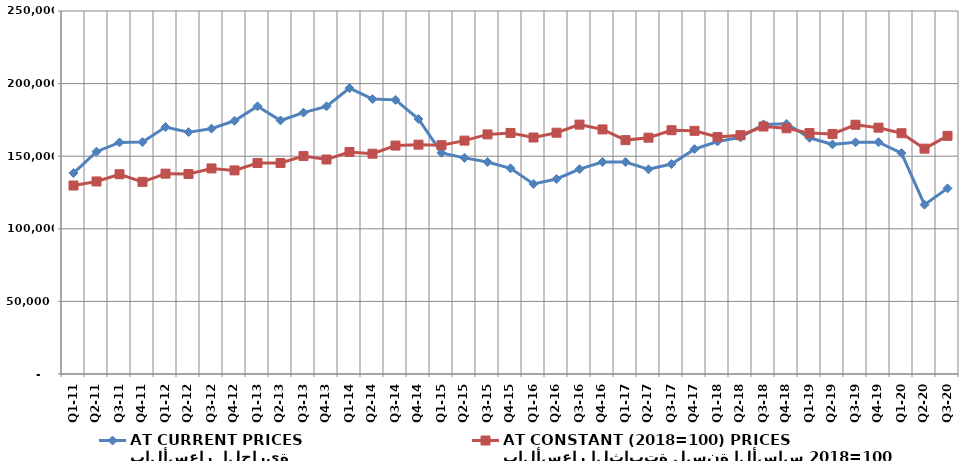
| Category | بالأسعار  الجارية 
AT CURRENT PRICES | بالأسعار الثابتة لسنة الأساس 2018=100
AT CONSTANT (2018=100) PRICES |
|---|---|---|
| Q1-11 | 138401.271 | 129804.239 |
| Q2-11 | 153089.762 | 132598.031 |
| Q3-11 | 159487.561 | 137565.295 |
| Q4-11 | 159723.384 | 132348.861 |
| Q1-12 | 170083.093 | 137982.104 |
| Q2-12 | 166591.685 | 137726.476 |
| Q3-12 | 168996.873 | 141580.056 |
| Q4-12 | 174402.297 | 140206.421 |
| Q1-13 | 184386.906 | 145295.802 |
| Q2-13 | 174597.258 | 145323.774 |
| Q3-13 | 180040.866 | 150108.501 |
| Q4-13 | 184343.591 | 147741.63 |
| Q1-14 | 196893.097 | 152884.316 |
| Q2-14 | 189356.652 | 151722.456 |
| Q3-14 | 188804.036 | 157306.957 |
| Q4-14 | 175603.753 | 157946.856 |
| Q1-15 | 152296.294 | 157548.933 |
| Q2-15 | 148854.913 | 160746.996 |
| Q3-15 | 145953.812 | 165017.31 |
| Q4-15 | 141628.419 | 166011.462 |
| Q1-16 | 130891.648 | 162867.899 |
| Q2-16 | 134312.351 | 166165.592 |
| Q3-16 | 141077.114 | 171750.759 |
| Q4-16 | 146024.029 | 168437.006 |
| Q1-17 | 145986.575 | 161083.599 |
| Q2-17 | 140973.578 | 162753.554 |
| Q3-17 | 144588.415 | 167889.538 |
| Q4-17 | 154852.238 | 167472.277 |
| Q1-18 | 160151.745 | 163190.321 |
| Q2-18 | 162958.727 | 164459.507 |
| Q3-18 | 171916.892 | 170445.991 |
| Q4-18 | 172311.868 | 169243.414 |
| Q1-19 | 162706.326 | 165895.897 |
| Q2-19 | 158139.213 | 165311.561 |
| Q3-19 | 159554.548 | 171662.34 |
| Q4-19 | 159648.598 | 169640.034 |
| Q1-20 | 152164.114 | 165822.724 |
| Q2-20 | 116591.341 | 155195.763 |
| Q3-20 | 127841.946 | 164017.41 |